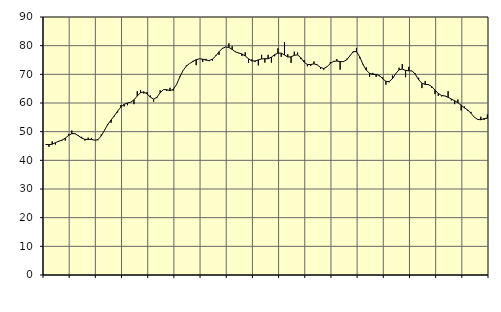
| Category | Piggar | Series 1 |
|---|---|---|
| nan | 45.5 | 45.55 |
| 87.0 | 44.7 | 45.47 |
| 87.0 | 46.6 | 45.63 |
| 87.0 | 45.5 | 46.15 |
| nan | 46.5 | 46.67 |
| 88.0 | 46.9 | 47.06 |
| 88.0 | 46.9 | 47.72 |
| 88.0 | 49.2 | 48.69 |
| nan | 50.4 | 49.32 |
| 89.0 | 49.4 | 49.28 |
| 89.0 | 48.8 | 48.59 |
| 89.0 | 48.2 | 47.78 |
| nan | 46.9 | 47.32 |
| 90.0 | 47.9 | 47.29 |
| 90.0 | 47.8 | 47.3 |
| 90.0 | 47 | 47.02 |
| nan | 47 | 47.22 |
| 91.0 | 49 | 48.52 |
| 91.0 | 50.6 | 50.51 |
| 91.0 | 52.3 | 52.54 |
| nan | 53.1 | 54.08 |
| 92.0 | 55.3 | 55.55 |
| 92.0 | 56.7 | 57.19 |
| 92.0 | 59.3 | 58.56 |
| nan | 58.8 | 59.55 |
| 93.0 | 59.2 | 60 |
| 93.0 | 60.2 | 60.27 |
| 93.0 | 59.6 | 61.09 |
| nan | 64.1 | 62.43 |
| 94.0 | 64.5 | 63.61 |
| 94.0 | 63.3 | 63.88 |
| 94.0 | 63.8 | 63.16 |
| nan | 62.6 | 62.07 |
| 95.0 | 60.5 | 61.34 |
| 95.0 | 61.7 | 62 |
| 95.0 | 64.4 | 63.6 |
| nan | 64.7 | 64.67 |
| 96.0 | 64.2 | 64.66 |
| 96.0 | 65.3 | 64.29 |
| 96.0 | 64.3 | 64.79 |
| nan | 66.5 | 66.45 |
| 97.0 | 69.2 | 69.02 |
| 97.0 | 71.3 | 71.32 |
| 97.0 | 73.1 | 72.86 |
| nan | 73.8 | 73.79 |
| 98.0 | 74.7 | 74.46 |
| 98.0 | 73.2 | 75.12 |
| 98.0 | 75.4 | 75.4 |
| nan | 74.3 | 75.31 |
| 99.0 | 75.4 | 74.95 |
| 99.0 | 74.6 | 74.82 |
| 99.0 | 74.8 | 75.31 |
| nan | 76.6 | 76.42 |
| 0.0 | 76.8 | 77.88 |
| 0.0 | 79.2 | 79.02 |
| 0.0 | 79.6 | 79.53 |
| nan | 80.8 | 79.4 |
| 1.0 | 79.8 | 78.71 |
| 1.0 | 78 | 77.85 |
| 1.0 | 77.5 | 77.41 |
| nan | 76.4 | 77.12 |
| 2.0 | 77.7 | 76.4 |
| 2.0 | 74 | 75.42 |
| 2.0 | 75.2 | 74.67 |
| nan | 74.3 | 74.66 |
| 3.0 | 73.1 | 75.03 |
| 3.0 | 76.8 | 75.36 |
| 3.0 | 74.1 | 75.46 |
| nan | 76.8 | 75.44 |
| 4.0 | 74.1 | 75.99 |
| 4.0 | 76.3 | 76.87 |
| 4.0 | 79.1 | 77.4 |
| nan | 76.1 | 77.39 |
| 5.0 | 81.2 | 76.76 |
| 5.0 | 77 | 76.04 |
| 5.0 | 74 | 76.1 |
| nan | 77.9 | 76.65 |
| 6.0 | 77.6 | 76.78 |
| 6.0 | 75.3 | 75.78 |
| 6.0 | 75 | 74.25 |
| nan | 72.8 | 73.42 |
| 7.0 | 72.9 | 73.4 |
| 7.0 | 74.5 | 73.66 |
| 7.0 | 73.4 | 73.3 |
| nan | 71.9 | 72.41 |
| 8.0 | 71.6 | 72.01 |
| 8.0 | 72.7 | 72.65 |
| 8.0 | 74.3 | 73.78 |
| nan | 74.4 | 74.53 |
| 9.0 | 75.3 | 74.63 |
| 9.0 | 71.6 | 74.42 |
| 9.0 | 74.6 | 74.44 |
| nan | 75.4 | 75.03 |
| 10.0 | 76.4 | 76.47 |
| 10.0 | 77.7 | 77.9 |
| 10.0 | 79.2 | 77.93 |
| nan | 75.6 | 76.07 |
| 11.0 | 73.6 | 73.46 |
| 11.0 | 72.4 | 71.44 |
| 11.0 | 69.2 | 70.37 |
| nan | 70.5 | 69.97 |
| 12.0 | 69.1 | 69.96 |
| 12.0 | 69.3 | 69.6 |
| 12.0 | 68.9 | 68.48 |
| nan | 66.4 | 67.55 |
| 13.0 | 67.2 | 67.48 |
| 13.0 | 69.6 | 68.47 |
| 13.0 | 70.2 | 70.24 |
| nan | 72.3 | 71.6 |
| 14.0 | 73.6 | 71.84 |
| 14.0 | 69 | 71.38 |
| 14.0 | 72.6 | 71.24 |
| nan | 71.2 | 71.19 |
| 15.0 | 70.3 | 69.98 |
| 15.0 | 68.8 | 68.1 |
| 15.0 | 65.2 | 66.9 |
| nan | 67.7 | 66.49 |
| 16.0 | 66.6 | 66.4 |
| 16.0 | 65.3 | 65.72 |
| 16.0 | 63.1 | 64.54 |
| nan | 62.5 | 63.34 |
| 17.0 | 62.3 | 62.61 |
| 17.0 | 62.4 | 62.47 |
| 17.0 | 64.1 | 61.99 |
| nan | 60.9 | 61.39 |
| 18.0 | 59.6 | 60.78 |
| 18.0 | 61.2 | 60.08 |
| 18.0 | 57.4 | 59.24 |
| nan | 58.8 | 58.28 |
| 19.0 | 57.2 | 57.57 |
| 19.0 | 56.9 | 56.41 |
| 19.0 | 55.1 | 55.06 |
| nan | 54.4 | 54.29 |
| 20.0 | 55.2 | 54.15 |
| 20.0 | 54.1 | 54.54 |
| 20.0 | 56 | 54.69 |